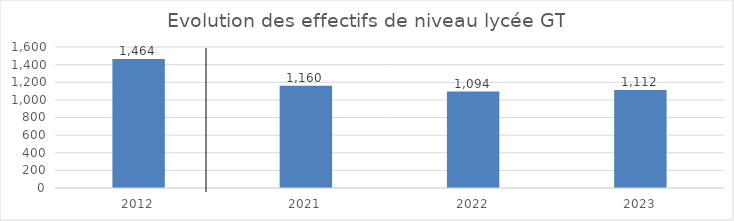
| Category | Series 0 |
|---|---|
| 2012.0 | 1464 |
| 2021.0 | 1160 |
| 2022.0 | 1094 |
| 2023.0 | 1112 |